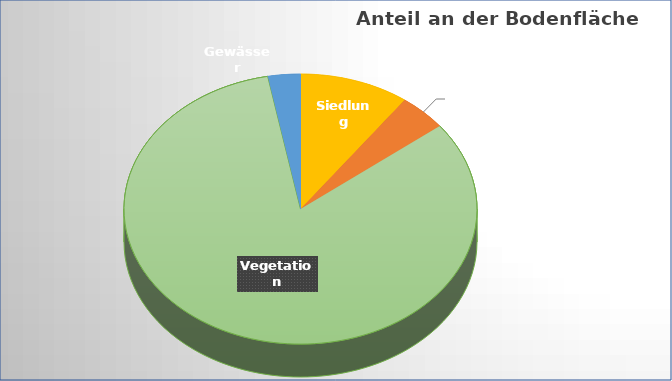
| Category | Series 0 |
|---|---|
| Siedlung | 14328 |
| Verkehr | 6320 |
| Vegetation | 117859 |
| Gewässer | 4250 |